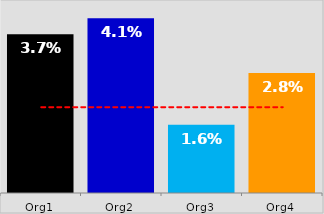
| Category | KPI / Metric |
|---|---|
| Org1 | 0.037 |
| Org2 | 0.041 |
| Org3 | 0.016 |
| Org4 | 0.028 |